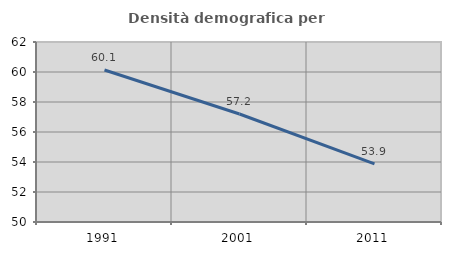
| Category | Densità demografica |
|---|---|
| 1991.0 | 60.134 |
| 2001.0 | 57.202 |
| 2011.0 | 53.876 |